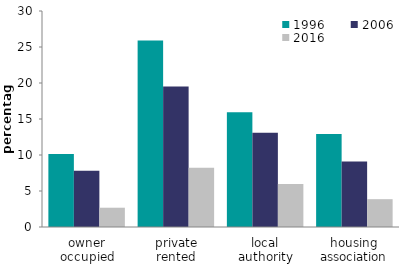
| Category | 1996 | 2006 | 2016 |
|---|---|---|---|
| owner occupied | 10.124 | 7.815 | 2.678 |
| private rented | 25.886 | 19.503 | 8.234 |
| local authority | 15.933 | 13.093 | 5.961 |
| housing association | 12.921 | 9.111 | 3.864 |